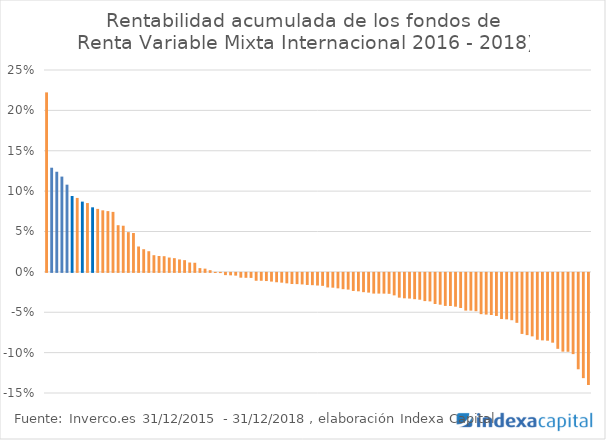
| Category | Series 0 |
|---|---|
| 0 | 0.222 |
| 1 | 0.129 |
| 2 | 0.124 |
| 3 | 0.118 |
| 4 | 0.108 |
| 5 | 0.094 |
| 6 | 0.092 |
| 7 | 0.087 |
| 8 | 0.085 |
| 9 | 0.08 |
| 10 | 0.078 |
| 11 | 0.076 |
| 12 | 0.075 |
| 13 | 0.074 |
| 14 | 0.058 |
| 15 | 0.057 |
| 16 | 0.049 |
| 17 | 0.048 |
| 18 | 0.031 |
| 19 | 0.028 |
| 20 | 0.026 |
| 21 | 0.021 |
| 22 | 0.02 |
| 23 | 0.019 |
| 24 | 0.018 |
| 25 | 0.017 |
| 26 | 0.015 |
| 27 | 0.015 |
| 28 | 0.012 |
| 29 | 0.011 |
| 30 | 0.005 |
| 31 | 0.004 |
| 32 | 0.002 |
| 33 | 0 |
| 34 | 0 |
| 35 | -0.003 |
| 36 | -0.003 |
| 37 | -0.003 |
| 38 | -0.006 |
| 39 | -0.006 |
| 40 | -0.006 |
| 41 | -0.01 |
| 42 | -0.01 |
| 43 | -0.01 |
| 44 | -0.011 |
| 45 | -0.012 |
| 46 | -0.012 |
| 47 | -0.013 |
| 48 | -0.014 |
| 49 | -0.014 |
| 50 | -0.014 |
| 51 | -0.015 |
| 52 | -0.015 |
| 53 | -0.016 |
| 54 | -0.016 |
| 55 | -0.018 |
| 56 | -0.018 |
| 57 | -0.019 |
| 58 | -0.02 |
| 59 | -0.021 |
| 60 | -0.022 |
| 61 | -0.023 |
| 62 | -0.024 |
| 63 | -0.024 |
| 64 | -0.026 |
| 65 | -0.026 |
| 66 | -0.026 |
| 67 | -0.026 |
| 68 | -0.028 |
| 69 | -0.031 |
| 70 | -0.032 |
| 71 | -0.032 |
| 72 | -0.033 |
| 73 | -0.033 |
| 74 | -0.035 |
| 75 | -0.035 |
| 76 | -0.039 |
| 77 | -0.039 |
| 78 | -0.041 |
| 79 | -0.041 |
| 80 | -0.042 |
| 81 | -0.043 |
| 82 | -0.047 |
| 83 | -0.047 |
| 84 | -0.047 |
| 85 | -0.051 |
| 86 | -0.052 |
| 87 | -0.052 |
| 88 | -0.053 |
| 89 | -0.057 |
| 90 | -0.058 |
| 91 | -0.059 |
| 92 | -0.062 |
| 93 | -0.076 |
| 94 | -0.077 |
| 95 | -0.079 |
| 96 | -0.083 |
| 97 | -0.084 |
| 98 | -0.084 |
| 99 | -0.086 |
| 100 | -0.094 |
| 101 | -0.098 |
| 102 | -0.098 |
| 103 | -0.101 |
| 104 | -0.119 |
| 105 | -0.13 |
| 106 | -0.139 |